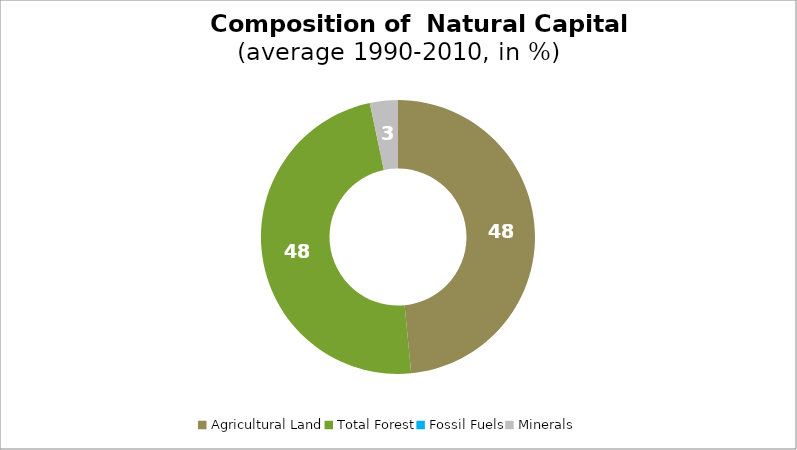
| Category | Series 0 |
|---|---|
| Agricultural Land | 48.462 |
| Total Forest | 48.235 |
| Fossil Fuels | 0 |
| Minerals | 3.303 |